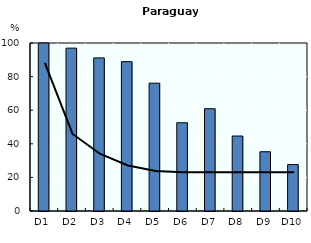
| Category | Informality rate |
|---|---|
| D1 | 100 |
| D2 | 96.944 |
| D3 | 91.143 |
| D4 | 88.903 |
| D5 | 76.089 |
| D6 | 52.531 |
| D7 | 60.882 |
| D8 | 44.636 |
| D9 | 35.267 |
| D10 | 27.61 |